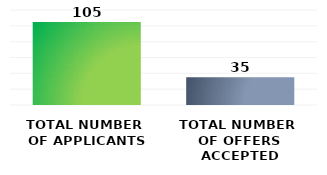
| Category | Series 0 |
|---|---|
| TOTAL NUMBER 
OF APPLICANTS | 105 |
| TOTAL NUMBER 
OF OFFERS ACCEPTED | 35 |